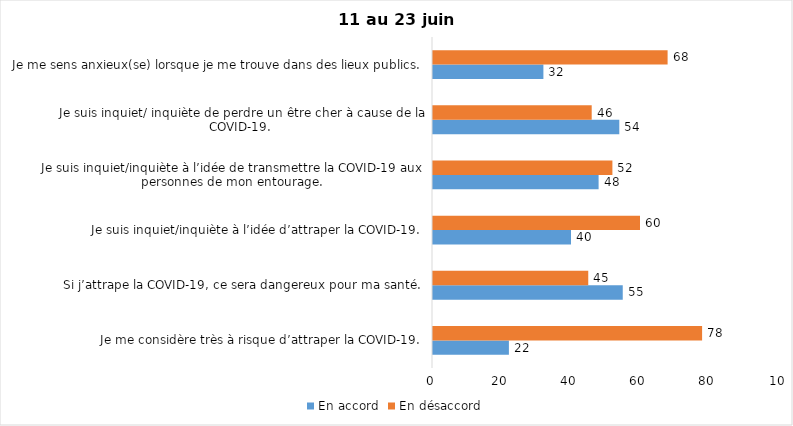
| Category | En accord | En désaccord |
|---|---|---|
| Je me considère très à risque d’attraper la COVID-19. | 22 | 78 |
| Si j’attrape la COVID-19, ce sera dangereux pour ma santé. | 55 | 45 |
| Je suis inquiet/inquiète à l’idée d’attraper la COVID-19. | 40 | 60 |
| Je suis inquiet/inquiète à l’idée de transmettre la COVID-19 aux personnes de mon entourage. | 48 | 52 |
| Je suis inquiet/ inquiète de perdre un être cher à cause de la COVID-19. | 54 | 46 |
| Je me sens anxieux(se) lorsque je me trouve dans des lieux publics. | 32 | 68 |